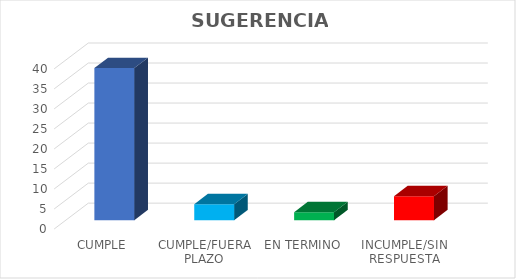
| Category | TOTAL |
|---|---|
| CUMPLE | 38 |
| CUMPLE/FUERA PLAZO | 4 |
| EN TERMINO | 2 |
| INCUMPLE/SIN RESPUESTA | 6 |